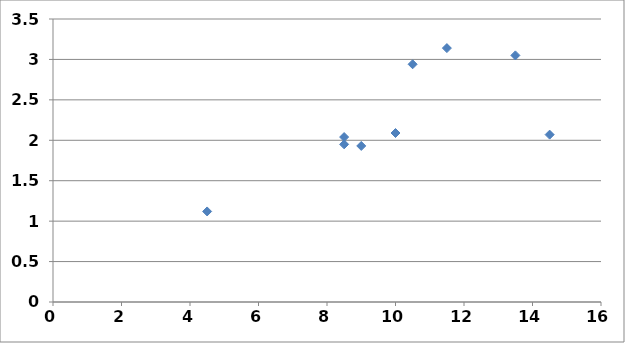
| Category | Series 0 |
|---|---|
| 8.5 | 1.95 |
| 10.0 | 2.09 |
| 9.0 | 1.93 |
| 13.5 | 3.05 |
| 14.5 | 2.07 |
| 11.5 | 3.14 |
| 4.5 | 1.12 |
| 10.5 | 2.94 |
| 8.5 | 2.04 |